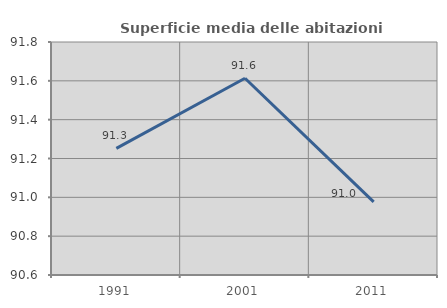
| Category | Superficie media delle abitazioni occupate |
|---|---|
| 1991.0 | 91.252 |
| 2001.0 | 91.613 |
| 2011.0 | 90.976 |